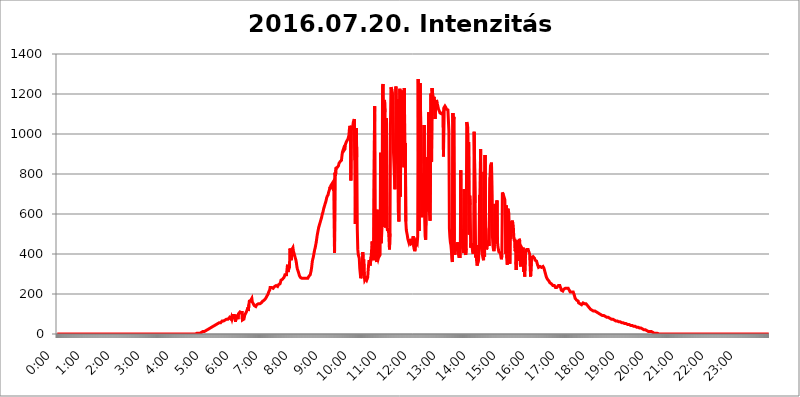
| Category | 2016.07.20. Intenzitás [W/m^2] |
|---|---|
| 0.0 | 0 |
| 0.0006944444444444445 | 0 |
| 0.001388888888888889 | 0 |
| 0.0020833333333333333 | 0 |
| 0.002777777777777778 | 0 |
| 0.003472222222222222 | 0 |
| 0.004166666666666667 | 0 |
| 0.004861111111111111 | 0 |
| 0.005555555555555556 | 0 |
| 0.0062499999999999995 | 0 |
| 0.006944444444444444 | 0 |
| 0.007638888888888889 | 0 |
| 0.008333333333333333 | 0 |
| 0.009027777777777779 | 0 |
| 0.009722222222222222 | 0 |
| 0.010416666666666666 | 0 |
| 0.011111111111111112 | 0 |
| 0.011805555555555555 | 0 |
| 0.012499999999999999 | 0 |
| 0.013194444444444444 | 0 |
| 0.013888888888888888 | 0 |
| 0.014583333333333332 | 0 |
| 0.015277777777777777 | 0 |
| 0.015972222222222224 | 0 |
| 0.016666666666666666 | 0 |
| 0.017361111111111112 | 0 |
| 0.018055555555555557 | 0 |
| 0.01875 | 0 |
| 0.019444444444444445 | 0 |
| 0.02013888888888889 | 0 |
| 0.020833333333333332 | 0 |
| 0.02152777777777778 | 0 |
| 0.022222222222222223 | 0 |
| 0.02291666666666667 | 0 |
| 0.02361111111111111 | 0 |
| 0.024305555555555556 | 0 |
| 0.024999999999999998 | 0 |
| 0.025694444444444447 | 0 |
| 0.02638888888888889 | 0 |
| 0.027083333333333334 | 0 |
| 0.027777777777777776 | 0 |
| 0.02847222222222222 | 0 |
| 0.029166666666666664 | 0 |
| 0.029861111111111113 | 0 |
| 0.030555555555555555 | 0 |
| 0.03125 | 0 |
| 0.03194444444444445 | 0 |
| 0.03263888888888889 | 0 |
| 0.03333333333333333 | 0 |
| 0.034027777777777775 | 0 |
| 0.034722222222222224 | 0 |
| 0.035416666666666666 | 0 |
| 0.036111111111111115 | 0 |
| 0.03680555555555556 | 0 |
| 0.0375 | 0 |
| 0.03819444444444444 | 0 |
| 0.03888888888888889 | 0 |
| 0.03958333333333333 | 0 |
| 0.04027777777777778 | 0 |
| 0.04097222222222222 | 0 |
| 0.041666666666666664 | 0 |
| 0.042361111111111106 | 0 |
| 0.04305555555555556 | 0 |
| 0.043750000000000004 | 0 |
| 0.044444444444444446 | 0 |
| 0.04513888888888889 | 0 |
| 0.04583333333333334 | 0 |
| 0.04652777777777778 | 0 |
| 0.04722222222222222 | 0 |
| 0.04791666666666666 | 0 |
| 0.04861111111111111 | 0 |
| 0.049305555555555554 | 0 |
| 0.049999999999999996 | 0 |
| 0.05069444444444445 | 0 |
| 0.051388888888888894 | 0 |
| 0.052083333333333336 | 0 |
| 0.05277777777777778 | 0 |
| 0.05347222222222222 | 0 |
| 0.05416666666666667 | 0 |
| 0.05486111111111111 | 0 |
| 0.05555555555555555 | 0 |
| 0.05625 | 0 |
| 0.05694444444444444 | 0 |
| 0.057638888888888885 | 0 |
| 0.05833333333333333 | 0 |
| 0.05902777777777778 | 0 |
| 0.059722222222222225 | 0 |
| 0.06041666666666667 | 0 |
| 0.061111111111111116 | 0 |
| 0.06180555555555556 | 0 |
| 0.0625 | 0 |
| 0.06319444444444444 | 0 |
| 0.06388888888888888 | 0 |
| 0.06458333333333334 | 0 |
| 0.06527777777777778 | 0 |
| 0.06597222222222222 | 0 |
| 0.06666666666666667 | 0 |
| 0.06736111111111111 | 0 |
| 0.06805555555555555 | 0 |
| 0.06874999999999999 | 0 |
| 0.06944444444444443 | 0 |
| 0.07013888888888889 | 0 |
| 0.07083333333333333 | 0 |
| 0.07152777777777779 | 0 |
| 0.07222222222222223 | 0 |
| 0.07291666666666667 | 0 |
| 0.07361111111111111 | 0 |
| 0.07430555555555556 | 0 |
| 0.075 | 0 |
| 0.07569444444444444 | 0 |
| 0.0763888888888889 | 0 |
| 0.07708333333333334 | 0 |
| 0.07777777777777778 | 0 |
| 0.07847222222222222 | 0 |
| 0.07916666666666666 | 0 |
| 0.0798611111111111 | 0 |
| 0.08055555555555556 | 0 |
| 0.08125 | 0 |
| 0.08194444444444444 | 0 |
| 0.08263888888888889 | 0 |
| 0.08333333333333333 | 0 |
| 0.08402777777777777 | 0 |
| 0.08472222222222221 | 0 |
| 0.08541666666666665 | 0 |
| 0.08611111111111112 | 0 |
| 0.08680555555555557 | 0 |
| 0.08750000000000001 | 0 |
| 0.08819444444444445 | 0 |
| 0.08888888888888889 | 0 |
| 0.08958333333333333 | 0 |
| 0.09027777777777778 | 0 |
| 0.09097222222222222 | 0 |
| 0.09166666666666667 | 0 |
| 0.09236111111111112 | 0 |
| 0.09305555555555556 | 0 |
| 0.09375 | 0 |
| 0.09444444444444444 | 0 |
| 0.09513888888888888 | 0 |
| 0.09583333333333333 | 0 |
| 0.09652777777777777 | 0 |
| 0.09722222222222222 | 0 |
| 0.09791666666666667 | 0 |
| 0.09861111111111111 | 0 |
| 0.09930555555555555 | 0 |
| 0.09999999999999999 | 0 |
| 0.10069444444444443 | 0 |
| 0.1013888888888889 | 0 |
| 0.10208333333333335 | 0 |
| 0.10277777777777779 | 0 |
| 0.10347222222222223 | 0 |
| 0.10416666666666667 | 0 |
| 0.10486111111111111 | 0 |
| 0.10555555555555556 | 0 |
| 0.10625 | 0 |
| 0.10694444444444444 | 0 |
| 0.1076388888888889 | 0 |
| 0.10833333333333334 | 0 |
| 0.10902777777777778 | 0 |
| 0.10972222222222222 | 0 |
| 0.1111111111111111 | 0 |
| 0.11180555555555556 | 0 |
| 0.11180555555555556 | 0 |
| 0.1125 | 0 |
| 0.11319444444444444 | 0 |
| 0.11388888888888889 | 0 |
| 0.11458333333333333 | 0 |
| 0.11527777777777777 | 0 |
| 0.11597222222222221 | 0 |
| 0.11666666666666665 | 0 |
| 0.1173611111111111 | 0 |
| 0.11805555555555557 | 0 |
| 0.11944444444444445 | 0 |
| 0.12013888888888889 | 0 |
| 0.12083333333333333 | 0 |
| 0.12152777777777778 | 0 |
| 0.12222222222222223 | 0 |
| 0.12291666666666667 | 0 |
| 0.12291666666666667 | 0 |
| 0.12361111111111112 | 0 |
| 0.12430555555555556 | 0 |
| 0.125 | 0 |
| 0.12569444444444444 | 0 |
| 0.12638888888888888 | 0 |
| 0.12708333333333333 | 0 |
| 0.16875 | 0 |
| 0.12847222222222224 | 0 |
| 0.12916666666666668 | 0 |
| 0.12986111111111112 | 0 |
| 0.13055555555555556 | 0 |
| 0.13125 | 0 |
| 0.13194444444444445 | 0 |
| 0.1326388888888889 | 0 |
| 0.13333333333333333 | 0 |
| 0.13402777777777777 | 0 |
| 0.13402777777777777 | 0 |
| 0.13472222222222222 | 0 |
| 0.13541666666666666 | 0 |
| 0.1361111111111111 | 0 |
| 0.13749999999999998 | 0 |
| 0.13819444444444443 | 0 |
| 0.1388888888888889 | 0 |
| 0.13958333333333334 | 0 |
| 0.14027777777777778 | 0 |
| 0.14097222222222222 | 0 |
| 0.14166666666666666 | 0 |
| 0.1423611111111111 | 0 |
| 0.14305555555555557 | 0 |
| 0.14375000000000002 | 0 |
| 0.14444444444444446 | 0 |
| 0.1451388888888889 | 0 |
| 0.1451388888888889 | 0 |
| 0.14652777777777778 | 0 |
| 0.14722222222222223 | 0 |
| 0.14791666666666667 | 0 |
| 0.1486111111111111 | 0 |
| 0.14930555555555555 | 0 |
| 0.15 | 0 |
| 0.15069444444444444 | 0 |
| 0.15138888888888888 | 0 |
| 0.15208333333333332 | 0 |
| 0.15277777777777776 | 0 |
| 0.15347222222222223 | 0 |
| 0.15416666666666667 | 0 |
| 0.15486111111111112 | 0 |
| 0.15555555555555556 | 0 |
| 0.15625 | 0 |
| 0.15694444444444444 | 0 |
| 0.15763888888888888 | 0 |
| 0.15833333333333333 | 0 |
| 0.15902777777777777 | 0 |
| 0.15972222222222224 | 0 |
| 0.16041666666666668 | 0 |
| 0.16111111111111112 | 0 |
| 0.16180555555555556 | 0 |
| 0.1625 | 0 |
| 0.16319444444444445 | 0 |
| 0.1638888888888889 | 0 |
| 0.16458333333333333 | 0 |
| 0.16527777777777777 | 0 |
| 0.16597222222222222 | 0 |
| 0.16666666666666666 | 0 |
| 0.1673611111111111 | 0 |
| 0.16805555555555554 | 0 |
| 0.16874999999999998 | 0 |
| 0.16944444444444443 | 0 |
| 0.17013888888888887 | 0 |
| 0.1708333333333333 | 0 |
| 0.17152777777777775 | 0 |
| 0.17222222222222225 | 0 |
| 0.1729166666666667 | 0 |
| 0.17361111111111113 | 0 |
| 0.17430555555555557 | 0 |
| 0.17500000000000002 | 0 |
| 0.17569444444444446 | 0 |
| 0.1763888888888889 | 0 |
| 0.17708333333333334 | 0 |
| 0.17777777777777778 | 0 |
| 0.17847222222222223 | 0 |
| 0.17916666666666667 | 0 |
| 0.1798611111111111 | 0 |
| 0.18055555555555555 | 0 |
| 0.18125 | 0 |
| 0.18194444444444444 | 0 |
| 0.1826388888888889 | 0 |
| 0.18333333333333335 | 0 |
| 0.1840277777777778 | 0 |
| 0.18472222222222223 | 0 |
| 0.18541666666666667 | 0 |
| 0.18611111111111112 | 0 |
| 0.18680555555555556 | 0 |
| 0.1875 | 0 |
| 0.18819444444444444 | 0 |
| 0.18888888888888888 | 0 |
| 0.18958333333333333 | 0 |
| 0.19027777777777777 | 0 |
| 0.1909722222222222 | 0 |
| 0.19166666666666665 | 0 |
| 0.19236111111111112 | 0 |
| 0.19305555555555554 | 0 |
| 0.19375 | 0 |
| 0.19444444444444445 | 3.525 |
| 0.1951388888888889 | 3.525 |
| 0.19583333333333333 | 3.525 |
| 0.19652777777777777 | 3.525 |
| 0.19722222222222222 | 3.525 |
| 0.19791666666666666 | 3.525 |
| 0.1986111111111111 | 3.525 |
| 0.19930555555555554 | 3.525 |
| 0.19999999999999998 | 3.525 |
| 0.20069444444444443 | 7.887 |
| 0.20138888888888887 | 7.887 |
| 0.2020833333333333 | 7.887 |
| 0.2027777777777778 | 7.887 |
| 0.2034722222222222 | 12.257 |
| 0.2041666666666667 | 12.257 |
| 0.20486111111111113 | 12.257 |
| 0.20555555555555557 | 12.257 |
| 0.20625000000000002 | 12.257 |
| 0.20694444444444446 | 16.636 |
| 0.2076388888888889 | 16.636 |
| 0.20833333333333334 | 16.636 |
| 0.20902777777777778 | 16.636 |
| 0.20972222222222223 | 21.024 |
| 0.21041666666666667 | 21.024 |
| 0.2111111111111111 | 21.024 |
| 0.21180555555555555 | 21.024 |
| 0.2125 | 25.419 |
| 0.21319444444444444 | 25.419 |
| 0.2138888888888889 | 29.823 |
| 0.21458333333333335 | 29.823 |
| 0.2152777777777778 | 29.823 |
| 0.21597222222222223 | 34.234 |
| 0.21666666666666667 | 34.234 |
| 0.21736111111111112 | 34.234 |
| 0.21805555555555556 | 38.653 |
| 0.21875 | 38.653 |
| 0.21944444444444444 | 38.653 |
| 0.22013888888888888 | 43.079 |
| 0.22083333333333333 | 43.079 |
| 0.22152777777777777 | 43.079 |
| 0.2222222222222222 | 43.079 |
| 0.22291666666666665 | 47.511 |
| 0.2236111111111111 | 47.511 |
| 0.22430555555555556 | 47.511 |
| 0.225 | 51.951 |
| 0.22569444444444445 | 51.951 |
| 0.2263888888888889 | 51.951 |
| 0.22708333333333333 | 56.398 |
| 0.22777777777777777 | 56.398 |
| 0.22847222222222222 | 56.398 |
| 0.22916666666666666 | 56.398 |
| 0.2298611111111111 | 60.85 |
| 0.23055555555555554 | 60.85 |
| 0.23124999999999998 | 65.31 |
| 0.23194444444444443 | 65.31 |
| 0.23263888888888887 | 65.31 |
| 0.2333333333333333 | 65.31 |
| 0.2340277777777778 | 69.775 |
| 0.2347222222222222 | 69.775 |
| 0.2354166666666667 | 69.775 |
| 0.23611111111111113 | 74.246 |
| 0.23680555555555557 | 74.246 |
| 0.23750000000000002 | 74.246 |
| 0.23819444444444446 | 74.246 |
| 0.2388888888888889 | 74.246 |
| 0.23958333333333334 | 74.246 |
| 0.24027777777777778 | 74.246 |
| 0.24097222222222223 | 78.722 |
| 0.24166666666666667 | 83.205 |
| 0.2423611111111111 | 83.205 |
| 0.24305555555555555 | 83.205 |
| 0.24375 | 74.246 |
| 0.24444444444444446 | 83.205 |
| 0.24513888888888888 | 74.246 |
| 0.24583333333333335 | 83.205 |
| 0.2465277777777778 | 92.184 |
| 0.24722222222222223 | 92.184 |
| 0.24791666666666667 | 92.184 |
| 0.24861111111111112 | 92.184 |
| 0.24930555555555556 | 83.205 |
| 0.25 | 60.85 |
| 0.25069444444444444 | 83.205 |
| 0.2513888888888889 | 96.682 |
| 0.2520833333333333 | 101.184 |
| 0.25277777777777777 | 101.184 |
| 0.2534722222222222 | 74.246 |
| 0.25416666666666665 | 101.184 |
| 0.2548611111111111 | 105.69 |
| 0.2555555555555556 | 105.69 |
| 0.25625000000000003 | 110.201 |
| 0.2569444444444445 | 110.201 |
| 0.2576388888888889 | 110.201 |
| 0.25833333333333336 | 105.69 |
| 0.2590277777777778 | 114.716 |
| 0.25972222222222224 | 69.775 |
| 0.2604166666666667 | 74.246 |
| 0.2611111111111111 | 74.246 |
| 0.26180555555555557 | 74.246 |
| 0.2625 | 69.775 |
| 0.26319444444444445 | 96.682 |
| 0.2638888888888889 | 96.682 |
| 0.26458333333333334 | 96.682 |
| 0.2652777777777778 | 110.201 |
| 0.2659722222222222 | 110.201 |
| 0.26666666666666666 | 123.758 |
| 0.2673611111111111 | 132.814 |
| 0.26805555555555555 | 114.716 |
| 0.26875 | 146.423 |
| 0.26944444444444443 | 164.605 |
| 0.2701388888888889 | 169.156 |
| 0.2708333333333333 | 164.605 |
| 0.27152777777777776 | 169.156 |
| 0.2722222222222222 | 164.605 |
| 0.27291666666666664 | 178.264 |
| 0.2736111111111111 | 160.056 |
| 0.2743055555555555 | 160.056 |
| 0.27499999999999997 | 150.964 |
| 0.27569444444444446 | 146.423 |
| 0.27638888888888885 | 141.884 |
| 0.27708333333333335 | 137.347 |
| 0.2777777777777778 | 137.347 |
| 0.27847222222222223 | 137.347 |
| 0.2791666666666667 | 141.884 |
| 0.2798611111111111 | 146.423 |
| 0.28055555555555556 | 150.964 |
| 0.28125 | 150.964 |
| 0.28194444444444444 | 150.964 |
| 0.2826388888888889 | 146.423 |
| 0.2833333333333333 | 146.423 |
| 0.28402777777777777 | 150.964 |
| 0.2847222222222222 | 150.964 |
| 0.28541666666666665 | 150.964 |
| 0.28611111111111115 | 155.509 |
| 0.28680555555555554 | 155.509 |
| 0.28750000000000003 | 160.056 |
| 0.2881944444444445 | 164.605 |
| 0.2888888888888889 | 164.605 |
| 0.28958333333333336 | 164.605 |
| 0.2902777777777778 | 169.156 |
| 0.29097222222222224 | 169.156 |
| 0.2916666666666667 | 173.709 |
| 0.2923611111111111 | 178.264 |
| 0.29305555555555557 | 182.82 |
| 0.29375 | 187.378 |
| 0.29444444444444445 | 187.378 |
| 0.2951388888888889 | 191.937 |
| 0.29583333333333334 | 201.058 |
| 0.2965277777777778 | 210.182 |
| 0.2972222222222222 | 210.182 |
| 0.29791666666666666 | 219.309 |
| 0.2986111111111111 | 233 |
| 0.29930555555555555 | 233 |
| 0.3 | 233 |
| 0.30069444444444443 | 233 |
| 0.3013888888888889 | 228.436 |
| 0.3020833333333333 | 228.436 |
| 0.30277777777777776 | 228.436 |
| 0.3034722222222222 | 228.436 |
| 0.30416666666666664 | 233 |
| 0.3048611111111111 | 237.564 |
| 0.3055555555555555 | 242.127 |
| 0.30624999999999997 | 242.127 |
| 0.3069444444444444 | 242.127 |
| 0.3076388888888889 | 237.564 |
| 0.30833333333333335 | 237.564 |
| 0.3090277777777778 | 237.564 |
| 0.30972222222222223 | 242.127 |
| 0.3104166666666667 | 246.689 |
| 0.3111111111111111 | 246.689 |
| 0.31180555555555556 | 246.689 |
| 0.3125 | 251.251 |
| 0.31319444444444444 | 260.373 |
| 0.3138888888888889 | 269.49 |
| 0.3145833333333333 | 274.047 |
| 0.31527777777777777 | 274.047 |
| 0.3159722222222222 | 274.047 |
| 0.31666666666666665 | 274.047 |
| 0.31736111111111115 | 278.603 |
| 0.31805555555555554 | 283.156 |
| 0.31875000000000003 | 283.156 |
| 0.3194444444444445 | 296.808 |
| 0.3201388888888889 | 292.259 |
| 0.32083333333333336 | 292.259 |
| 0.3215277777777778 | 296.808 |
| 0.32222222222222224 | 301.354 |
| 0.3229166666666667 | 346.682 |
| 0.3236111111111111 | 310.44 |
| 0.32430555555555557 | 319.517 |
| 0.325 | 324.052 |
| 0.32569444444444445 | 333.113 |
| 0.3263888888888889 | 427.39 |
| 0.32708333333333334 | 405.108 |
| 0.3277777777777778 | 378.224 |
| 0.3284722222222222 | 369.23 |
| 0.32916666666666666 | 422.943 |
| 0.3298611111111111 | 427.39 |
| 0.33055555555555555 | 431.833 |
| 0.33125 | 414.035 |
| 0.33194444444444443 | 405.108 |
| 0.3326388888888889 | 396.164 |
| 0.3333333333333333 | 387.202 |
| 0.3340277777777778 | 378.224 |
| 0.3347222222222222 | 369.23 |
| 0.3354166666666667 | 355.712 |
| 0.3361111111111111 | 337.639 |
| 0.3368055555555556 | 324.052 |
| 0.33749999999999997 | 319.517 |
| 0.33819444444444446 | 310.44 |
| 0.33888888888888885 | 301.354 |
| 0.33958333333333335 | 292.259 |
| 0.34027777777777773 | 287.709 |
| 0.34097222222222223 | 283.156 |
| 0.3416666666666666 | 278.603 |
| 0.3423611111111111 | 278.603 |
| 0.3430555555555555 | 278.603 |
| 0.34375 | 278.603 |
| 0.3444444444444445 | 274.047 |
| 0.3451388888888889 | 278.603 |
| 0.3458333333333334 | 278.603 |
| 0.34652777777777777 | 278.603 |
| 0.34722222222222227 | 278.603 |
| 0.34791666666666665 | 278.603 |
| 0.34861111111111115 | 278.603 |
| 0.34930555555555554 | 278.603 |
| 0.35000000000000003 | 278.603 |
| 0.3506944444444444 | 278.603 |
| 0.3513888888888889 | 278.603 |
| 0.3520833333333333 | 283.156 |
| 0.3527777777777778 | 287.709 |
| 0.3534722222222222 | 287.709 |
| 0.3541666666666667 | 292.259 |
| 0.3548611111111111 | 296.808 |
| 0.35555555555555557 | 301.354 |
| 0.35625 | 319.517 |
| 0.35694444444444445 | 337.639 |
| 0.3576388888888889 | 360.221 |
| 0.35833333333333334 | 373.729 |
| 0.3590277777777778 | 382.715 |
| 0.3597222222222222 | 396.164 |
| 0.36041666666666666 | 409.574 |
| 0.3611111111111111 | 422.943 |
| 0.36180555555555555 | 431.833 |
| 0.3625 | 445.129 |
| 0.36319444444444443 | 458.38 |
| 0.3638888888888889 | 475.972 |
| 0.3645833333333333 | 493.475 |
| 0.3652777777777778 | 506.542 |
| 0.3659722222222222 | 519.555 |
| 0.3666666666666667 | 532.513 |
| 0.3673611111111111 | 536.82 |
| 0.3680555555555556 | 549.704 |
| 0.36874999999999997 | 558.261 |
| 0.36944444444444446 | 566.793 |
| 0.37013888888888885 | 575.299 |
| 0.37083333333333335 | 583.779 |
| 0.37152777777777773 | 596.45 |
| 0.37222222222222223 | 604.864 |
| 0.3729166666666666 | 613.252 |
| 0.3736111111111111 | 625.784 |
| 0.3743055555555555 | 634.105 |
| 0.375 | 642.4 |
| 0.3756944444444445 | 650.667 |
| 0.3763888888888889 | 658.909 |
| 0.3770833333333334 | 667.123 |
| 0.37777777777777777 | 679.395 |
| 0.37847222222222227 | 687.544 |
| 0.37916666666666665 | 691.608 |
| 0.37986111111111115 | 695.666 |
| 0.38055555555555554 | 707.8 |
| 0.38125000000000003 | 715.858 |
| 0.3819444444444444 | 723.889 |
| 0.3826388888888889 | 735.89 |
| 0.3833333333333333 | 723.889 |
| 0.3840277777777778 | 743.859 |
| 0.3847222222222222 | 747.834 |
| 0.3854166666666667 | 751.803 |
| 0.3861111111111111 | 755.766 |
| 0.38680555555555557 | 759.723 |
| 0.3875 | 715.858 |
| 0.38819444444444445 | 763.674 |
| 0.3888888888888889 | 405.108 |
| 0.38958333333333334 | 806.757 |
| 0.3902777777777778 | 791.169 |
| 0.3909722222222222 | 829.981 |
| 0.39166666666666666 | 833.834 |
| 0.3923611111111111 | 833.834 |
| 0.39305555555555555 | 833.834 |
| 0.39375 | 833.834 |
| 0.39444444444444443 | 841.526 |
| 0.3951388888888889 | 853.029 |
| 0.3958333333333333 | 856.855 |
| 0.3965277777777778 | 860.676 |
| 0.3972222222222222 | 864.493 |
| 0.3979166666666667 | 860.676 |
| 0.3986111111111111 | 868.305 |
| 0.3993055555555556 | 891.099 |
| 0.39999999999999997 | 909.996 |
| 0.40069444444444446 | 917.534 |
| 0.40138888888888885 | 925.06 |
| 0.40208333333333335 | 917.534 |
| 0.40277777777777773 | 917.534 |
| 0.40347222222222223 | 925.06 |
| 0.4041666666666666 | 947.58 |
| 0.4048611111111111 | 955.071 |
| 0.4055555555555555 | 955.071 |
| 0.40625 | 966.295 |
| 0.4069444444444445 | 966.295 |
| 0.4076388888888889 | 973.772 |
| 0.4083333333333334 | 977.508 |
| 0.40902777777777777 | 992.448 |
| 0.40972222222222227 | 1022.323 |
| 0.41041666666666665 | 1041.019 |
| 0.41111111111111115 | 1033.537 |
| 0.41180555555555554 | 767.62 |
| 0.41250000000000003 | 1037.277 |
| 0.4131944444444444 | 1029.798 |
| 0.4138888888888889 | 1033.537 |
| 0.4145833333333333 | 1041.019 |
| 0.4152777777777778 | 1059.756 |
| 0.4159722222222222 | 1067.267 |
| 0.4166666666666667 | 1074.789 |
| 0.4173611111111111 | 868.305 |
| 0.41805555555555557 | 549.704 |
| 0.41875 | 992.448 |
| 0.41944444444444445 | 1029.798 |
| 0.4201388888888889 | 883.516 |
| 0.42083333333333334 | 523.88 |
| 0.4215277777777778 | 422.943 |
| 0.4222222222222222 | 396.164 |
| 0.42291666666666666 | 396.164 |
| 0.4236111111111111 | 378.224 |
| 0.42430555555555555 | 328.584 |
| 0.425 | 301.354 |
| 0.42569444444444443 | 278.603 |
| 0.4263888888888889 | 287.709 |
| 0.4270833333333333 | 305.898 |
| 0.4277777777777778 | 324.052 |
| 0.4284722222222222 | 409.574 |
| 0.4291666666666667 | 364.728 |
| 0.4298611111111111 | 373.729 |
| 0.4305555555555556 | 292.259 |
| 0.43124999999999997 | 269.49 |
| 0.43194444444444446 | 269.49 |
| 0.43263888888888885 | 278.603 |
| 0.43333333333333335 | 278.603 |
| 0.43402777777777773 | 269.49 |
| 0.43472222222222223 | 264.932 |
| 0.4354166666666666 | 283.156 |
| 0.4361111111111111 | 319.517 |
| 0.4368055555555555 | 351.198 |
| 0.4375 | 369.23 |
| 0.4381944444444445 | 355.712 |
| 0.4388888888888889 | 342.162 |
| 0.4395833333333334 | 342.162 |
| 0.44027777777777777 | 387.202 |
| 0.44097222222222227 | 387.202 |
| 0.44166666666666665 | 462.786 |
| 0.44236111111111115 | 427.39 |
| 0.44305555555555554 | 400.638 |
| 0.44375000000000003 | 369.23 |
| 0.4444444444444444 | 369.23 |
| 0.4451388888888889 | 1139.384 |
| 0.4458333333333333 | 414.035 |
| 0.4465277777777778 | 396.164 |
| 0.4472222222222222 | 373.729 |
| 0.4479166666666667 | 360.221 |
| 0.4486111111111111 | 621.613 |
| 0.44930555555555557 | 382.715 |
| 0.45 | 373.729 |
| 0.45069444444444445 | 382.715 |
| 0.4513888888888889 | 382.715 |
| 0.45208333333333334 | 378.224 |
| 0.4527777777777778 | 396.164 |
| 0.4534722222222222 | 906.223 |
| 0.45416666666666666 | 453.968 |
| 0.4548611111111111 | 484.735 |
| 0.45555555555555555 | 541.121 |
| 0.45625 | 1238.014 |
| 0.45694444444444443 | 1250.275 |
| 0.4576388888888889 | 536.82 |
| 0.4583333333333333 | 549.704 |
| 0.4590277777777778 | 1170.358 |
| 0.4597222222222222 | 1108.816 |
| 0.4604166666666667 | 532.513 |
| 0.4611111111111111 | 999.916 |
| 0.4618055555555556 | 1078.555 |
| 0.46249999999999997 | 536.82 |
| 0.46319444444444446 | 515.223 |
| 0.46388888888888885 | 528.2 |
| 0.46458333333333335 | 515.223 |
| 0.46527777777777773 | 475.972 |
| 0.46597222222222223 | 422.943 |
| 0.4666666666666666 | 502.192 |
| 0.4673611111111111 | 1044.762 |
| 0.4680555555555555 | 1233.951 |
| 0.46875 | 1229.899 |
| 0.4694444444444445 | 1217.812 |
| 0.4701388888888889 | 1205.82 |
| 0.4708333333333334 | 1201.843 |
| 0.47152777777777777 | 913.766 |
| 0.47222222222222227 | 917.534 |
| 0.47291666666666665 | 909.996 |
| 0.47361111111111115 | 723.889 |
| 0.47430555555555554 | 891.099 |
| 0.47500000000000003 | 1238.014 |
| 0.4756944444444444 | 1233.951 |
| 0.4763888888888889 | 853.029 |
| 0.4770833333333333 | 894.885 |
| 0.4777777777777778 | 1174.263 |
| 0.4784722222222222 | 609.062 |
| 0.4791666666666667 | 562.53 |
| 0.4798611111111111 | 909.996 |
| 0.48055555555555557 | 1225.859 |
| 0.48125 | 687.544 |
| 0.48194444444444445 | 1067.267 |
| 0.4826388888888889 | 1197.876 |
| 0.48333333333333334 | 1205.82 |
| 0.4840277777777778 | 1217.812 |
| 0.4847222222222222 | 1120.238 |
| 0.48541666666666666 | 925.06 |
| 0.4861111111111111 | 833.834 |
| 0.48680555555555555 | 1229.899 |
| 0.4875 | 891.099 |
| 0.48819444444444443 | 955.071 |
| 0.4888888888888889 | 562.53 |
| 0.4895833333333333 | 519.555 |
| 0.4902777777777778 | 506.542 |
| 0.4909722222222222 | 493.475 |
| 0.4916666666666667 | 475.972 |
| 0.4923611111111111 | 467.187 |
| 0.4930555555555556 | 458.38 |
| 0.49374999999999997 | 462.786 |
| 0.49444444444444446 | 475.972 |
| 0.49513888888888885 | 458.38 |
| 0.49583333333333335 | 449.551 |
| 0.49652777777777773 | 445.129 |
| 0.49722222222222223 | 445.129 |
| 0.4979166666666666 | 453.968 |
| 0.4986111111111111 | 453.968 |
| 0.4993055555555555 | 489.108 |
| 0.5 | 436.27 |
| 0.5006944444444444 | 422.943 |
| 0.5013888888888889 | 414.035 |
| 0.5020833333333333 | 427.39 |
| 0.5027777777777778 | 445.129 |
| 0.5034722222222222 | 462.786 |
| 0.5041666666666667 | 462.786 |
| 0.5048611111111111 | 453.968 |
| 0.5055555555555555 | 489.108 |
| 0.50625 | 1275.142 |
| 0.5069444444444444 | 617.436 |
| 0.5076388888888889 | 515.223 |
| 0.5083333333333333 | 958.814 |
| 0.5090277777777777 | 1254.387 |
| 0.5097222222222222 | 1258.511 |
| 0.5104166666666666 | 853.029 |
| 0.5111111111111112 | 583.779 |
| 0.5118055555555555 | 583.779 |
| 0.5125000000000001 | 759.723 |
| 0.5131944444444444 | 802.868 |
| 0.513888888888889 | 596.45 |
| 0.5145833333333333 | 1044.762 |
| 0.5152777777777778 | 583.779 |
| 0.5159722222222222 | 489.108 |
| 0.5166666666666667 | 471.582 |
| 0.517361111111111 | 613.252 |
| 0.5180555555555556 | 883.516 |
| 0.5187499999999999 | 613.252 |
| 0.5194444444444445 | 650.667 |
| 0.5201388888888888 | 833.834 |
| 0.5208333333333334 | 1108.816 |
| 0.5215277777777778 | 613.252 |
| 0.5222222222222223 | 596.45 |
| 0.5229166666666667 | 566.793 |
| 0.5236111111111111 | 566.793 |
| 0.5243055555555556 | 1201.843 |
| 0.525 | 860.676 |
| 0.5256944444444445 | 1229.899 |
| 0.5263888888888889 | 1205.82 |
| 0.5270833333333333 | 1186.03 |
| 0.5277777777777778 | 1170.358 |
| 0.5284722222222222 | 1186.03 |
| 0.5291666666666667 | 1186.03 |
| 0.5298611111111111 | 1074.789 |
| 0.5305555555555556 | 1124.056 |
| 0.53125 | 1120.238 |
| 0.5319444444444444 | 1170.358 |
| 0.5326388888888889 | 1154.814 |
| 0.5333333333333333 | 1147.086 |
| 0.5340277777777778 | 1135.543 |
| 0.5347222222222222 | 1124.056 |
| 0.5354166666666667 | 1120.238 |
| 0.5361111111111111 | 1112.618 |
| 0.5368055555555555 | 1105.019 |
| 0.5375 | 1101.226 |
| 0.5381944444444444 | 1101.226 |
| 0.5388888888888889 | 1101.226 |
| 0.5395833333333333 | 1101.226 |
| 0.5402777777777777 | 1105.019 |
| 0.5409722222222222 | 1108.816 |
| 0.5416666666666666 | 887.309 |
| 0.5423611111111112 | 1131.708 |
| 0.5430555555555555 | 1135.543 |
| 0.5437500000000001 | 1139.384 |
| 0.5444444444444444 | 1135.543 |
| 0.545138888888889 | 1131.708 |
| 0.5458333333333333 | 1124.056 |
| 0.5465277777777778 | 1124.056 |
| 0.5472222222222222 | 1127.879 |
| 0.5479166666666667 | 1120.238 |
| 0.548611111111111 | 1124.056 |
| 0.5493055555555556 | 1014.852 |
| 0.5499999999999999 | 528.2 |
| 0.5506944444444445 | 484.735 |
| 0.5513888888888888 | 458.38 |
| 0.5520833333333334 | 445.129 |
| 0.5527777777777778 | 418.492 |
| 0.5534722222222223 | 378.224 |
| 0.5541666666666667 | 360.221 |
| 0.5548611111111111 | 1105.019 |
| 0.5555555555555556 | 1059.756 |
| 0.55625 | 1086.097 |
| 0.5569444444444445 | 467.187 |
| 0.5576388888888889 | 396.164 |
| 0.5583333333333333 | 431.833 |
| 0.5590277777777778 | 414.035 |
| 0.5597222222222222 | 431.833 |
| 0.5604166666666667 | 445.129 |
| 0.5611111111111111 | 458.38 |
| 0.5618055555555556 | 440.702 |
| 0.5625 | 405.108 |
| 0.5631944444444444 | 387.202 |
| 0.5638888888888889 | 382.715 |
| 0.5645833333333333 | 382.715 |
| 0.5652777777777778 | 387.202 |
| 0.5659722222222222 | 818.392 |
| 0.5666666666666667 | 462.786 |
| 0.5673611111111111 | 480.356 |
| 0.5680555555555555 | 523.88 |
| 0.56875 | 427.39 |
| 0.5694444444444444 | 414.035 |
| 0.5701388888888889 | 405.108 |
| 0.5708333333333333 | 723.889 |
| 0.5715277777777777 | 445.129 |
| 0.5722222222222222 | 405.108 |
| 0.5729166666666666 | 396.164 |
| 0.5736111111111112 | 427.39 |
| 0.5743055555555555 | 1059.756 |
| 0.5750000000000001 | 1059.756 |
| 0.5756944444444444 | 1033.537 |
| 0.576388888888889 | 943.832 |
| 0.5770833333333333 | 958.814 |
| 0.5777777777777778 | 497.836 |
| 0.5784722222222222 | 691.608 |
| 0.5791666666666667 | 646.537 |
| 0.579861111111111 | 431.833 |
| 0.5805555555555556 | 453.968 |
| 0.5812499999999999 | 440.702 |
| 0.5819444444444445 | 431.833 |
| 0.5826388888888888 | 409.574 |
| 0.5833333333333334 | 400.638 |
| 0.5840277777777778 | 414.035 |
| 0.5847222222222223 | 1011.118 |
| 0.5854166666666667 | 1007.383 |
| 0.5861111111111111 | 654.791 |
| 0.5868055555555556 | 382.715 |
| 0.5875 | 445.129 |
| 0.5881944444444445 | 364.728 |
| 0.5888888888888889 | 342.162 |
| 0.5895833333333333 | 337.639 |
| 0.5902777777777778 | 346.682 |
| 0.5909722222222222 | 373.729 |
| 0.5916666666666667 | 440.702 |
| 0.5923611111111111 | 695.666 |
| 0.5930555555555556 | 658.909 |
| 0.59375 | 925.06 |
| 0.5944444444444444 | 449.551 |
| 0.5951388888888889 | 422.943 |
| 0.5958333333333333 | 405.108 |
| 0.5965277777777778 | 391.685 |
| 0.5972222222222222 | 378.224 |
| 0.5979166666666667 | 369.23 |
| 0.5986111111111111 | 810.641 |
| 0.5993055555555555 | 387.202 |
| 0.6 | 894.885 |
| 0.6006944444444444 | 532.513 |
| 0.6013888888888889 | 523.88 |
| 0.6020833333333333 | 422.943 |
| 0.6027777777777777 | 431.833 |
| 0.6034722222222222 | 431.833 |
| 0.6041666666666666 | 431.833 |
| 0.6048611111111112 | 467.187 |
| 0.6055555555555555 | 440.702 |
| 0.6062500000000001 | 440.702 |
| 0.6069444444444444 | 783.342 |
| 0.607638888888889 | 841.526 |
| 0.6083333333333333 | 845.365 |
| 0.6090277777777778 | 856.855 |
| 0.6097222222222222 | 860.676 |
| 0.6104166666666667 | 484.735 |
| 0.611111111111111 | 440.702 |
| 0.6118055555555556 | 422.943 |
| 0.6124999999999999 | 414.035 |
| 0.6131944444444445 | 445.129 |
| 0.6138888888888888 | 650.667 |
| 0.6145833333333334 | 453.968 |
| 0.6152777777777778 | 566.793 |
| 0.6159722222222223 | 475.972 |
| 0.6166666666666667 | 667.123 |
| 0.6173611111111111 | 462.786 |
| 0.6180555555555556 | 436.27 |
| 0.61875 | 422.943 |
| 0.6194444444444445 | 409.574 |
| 0.6201388888888889 | 409.574 |
| 0.6208333333333333 | 414.035 |
| 0.6215277777777778 | 405.108 |
| 0.6222222222222222 | 387.202 |
| 0.6229166666666667 | 373.729 |
| 0.6236111111111111 | 391.685 |
| 0.6243055555555556 | 707.8 |
| 0.625 | 703.762 |
| 0.6256944444444444 | 695.666 |
| 0.6263888888888889 | 687.544 |
| 0.6270833333333333 | 683.473 |
| 0.6277777777777778 | 671.22 |
| 0.6284722222222222 | 536.82 |
| 0.6291666666666667 | 400.638 |
| 0.6298611111111111 | 642.4 |
| 0.6305555555555555 | 378.224 |
| 0.63125 | 346.682 |
| 0.6319444444444444 | 625.784 |
| 0.6326388888888889 | 617.436 |
| 0.6333333333333333 | 604.864 |
| 0.6340277777777777 | 502.192 |
| 0.6347222222222222 | 351.198 |
| 0.6354166666666666 | 549.704 |
| 0.6361111111111112 | 475.972 |
| 0.6368055555555555 | 562.53 |
| 0.6375000000000001 | 536.82 |
| 0.6381944444444444 | 566.793 |
| 0.638888888888889 | 553.986 |
| 0.6395833333333333 | 541.121 |
| 0.6402777777777778 | 489.108 |
| 0.6409722222222222 | 467.187 |
| 0.6416666666666667 | 475.972 |
| 0.642361111111111 | 414.035 |
| 0.6430555555555556 | 445.129 |
| 0.6437499999999999 | 319.517 |
| 0.6444444444444445 | 467.187 |
| 0.6451388888888888 | 422.943 |
| 0.6458333333333334 | 449.551 |
| 0.6465277777777778 | 364.728 |
| 0.6472222222222223 | 436.27 |
| 0.6479166666666667 | 475.972 |
| 0.6486111111111111 | 467.187 |
| 0.6493055555555556 | 351.198 |
| 0.65 | 337.639 |
| 0.6506944444444445 | 436.27 |
| 0.6513888888888889 | 436.27 |
| 0.6520833333333333 | 436.27 |
| 0.6527777777777778 | 422.943 |
| 0.6534722222222222 | 431.833 |
| 0.6541666666666667 | 310.44 |
| 0.6548611111111111 | 333.113 |
| 0.6555555555555556 | 287.709 |
| 0.65625 | 292.259 |
| 0.6569444444444444 | 414.035 |
| 0.6576388888888889 | 418.492 |
| 0.6583333333333333 | 422.943 |
| 0.6590277777777778 | 427.39 |
| 0.6597222222222222 | 427.39 |
| 0.6604166666666667 | 422.943 |
| 0.6611111111111111 | 414.035 |
| 0.6618055555555555 | 409.574 |
| 0.6625 | 400.638 |
| 0.6631944444444444 | 342.162 |
| 0.6638888888888889 | 287.709 |
| 0.6645833333333333 | 292.259 |
| 0.6652777777777777 | 382.715 |
| 0.6659722222222222 | 382.715 |
| 0.6666666666666666 | 382.715 |
| 0.6673611111111111 | 387.202 |
| 0.6680555555555556 | 387.202 |
| 0.6687500000000001 | 387.202 |
| 0.6694444444444444 | 378.224 |
| 0.6701388888888888 | 369.23 |
| 0.6708333333333334 | 369.23 |
| 0.6715277777777778 | 369.23 |
| 0.6722222222222222 | 364.728 |
| 0.6729166666666666 | 355.712 |
| 0.6736111111111112 | 346.682 |
| 0.6743055555555556 | 342.162 |
| 0.6749999999999999 | 333.113 |
| 0.6756944444444444 | 328.584 |
| 0.6763888888888889 | 333.113 |
| 0.6770833333333334 | 337.639 |
| 0.6777777777777777 | 337.639 |
| 0.6784722222222223 | 333.113 |
| 0.6791666666666667 | 333.113 |
| 0.6798611111111111 | 333.113 |
| 0.6805555555555555 | 333.113 |
| 0.68125 | 337.639 |
| 0.6819444444444445 | 337.639 |
| 0.6826388888888889 | 328.584 |
| 0.6833333333333332 | 319.517 |
| 0.6840277777777778 | 310.44 |
| 0.6847222222222222 | 301.354 |
| 0.6854166666666667 | 292.259 |
| 0.686111111111111 | 283.156 |
| 0.6868055555555556 | 278.603 |
| 0.6875 | 274.047 |
| 0.6881944444444444 | 274.047 |
| 0.688888888888889 | 269.49 |
| 0.6895833333333333 | 264.932 |
| 0.6902777777777778 | 260.373 |
| 0.6909722222222222 | 255.813 |
| 0.6916666666666668 | 255.813 |
| 0.6923611111111111 | 251.251 |
| 0.6930555555555555 | 251.251 |
| 0.69375 | 251.251 |
| 0.6944444444444445 | 246.689 |
| 0.6951388888888889 | 242.127 |
| 0.6958333333333333 | 242.127 |
| 0.6965277777777777 | 242.127 |
| 0.6972222222222223 | 242.127 |
| 0.6979166666666666 | 237.564 |
| 0.6986111111111111 | 233 |
| 0.6993055555555556 | 233 |
| 0.7000000000000001 | 233 |
| 0.7006944444444444 | 233 |
| 0.7013888888888888 | 233 |
| 0.7020833333333334 | 237.564 |
| 0.7027777777777778 | 242.127 |
| 0.7034722222222222 | 242.127 |
| 0.7041666666666666 | 242.127 |
| 0.7048611111111112 | 242.127 |
| 0.7055555555555556 | 237.564 |
| 0.7062499999999999 | 228.436 |
| 0.7069444444444444 | 219.309 |
| 0.7076388888888889 | 214.746 |
| 0.7083333333333334 | 214.746 |
| 0.7090277777777777 | 214.746 |
| 0.7097222222222223 | 219.309 |
| 0.7104166666666667 | 223.873 |
| 0.7111111111111111 | 228.436 |
| 0.7118055555555555 | 228.436 |
| 0.7125 | 228.436 |
| 0.7131944444444445 | 228.436 |
| 0.7138888888888889 | 228.436 |
| 0.7145833333333332 | 228.436 |
| 0.7152777777777778 | 228.436 |
| 0.7159722222222222 | 228.436 |
| 0.7166666666666667 | 228.436 |
| 0.717361111111111 | 223.873 |
| 0.7180555555555556 | 219.309 |
| 0.71875 | 214.746 |
| 0.7194444444444444 | 210.182 |
| 0.720138888888889 | 210.182 |
| 0.7208333333333333 | 210.182 |
| 0.7215277777777778 | 210.182 |
| 0.7222222222222222 | 210.182 |
| 0.7229166666666668 | 210.182 |
| 0.7236111111111111 | 210.182 |
| 0.7243055555555555 | 205.62 |
| 0.725 | 196.497 |
| 0.7256944444444445 | 187.378 |
| 0.7263888888888889 | 178.264 |
| 0.7270833333333333 | 173.709 |
| 0.7277777777777777 | 173.709 |
| 0.7284722222222223 | 169.156 |
| 0.7291666666666666 | 169.156 |
| 0.7298611111111111 | 164.605 |
| 0.7305555555555556 | 164.605 |
| 0.7312500000000001 | 155.509 |
| 0.7319444444444444 | 155.509 |
| 0.7326388888888888 | 155.509 |
| 0.7333333333333334 | 150.964 |
| 0.7340277777777778 | 150.964 |
| 0.7347222222222222 | 146.423 |
| 0.7354166666666666 | 146.423 |
| 0.7361111111111112 | 146.423 |
| 0.7368055555555556 | 150.964 |
| 0.7374999999999999 | 155.509 |
| 0.7381944444444444 | 155.509 |
| 0.7388888888888889 | 155.509 |
| 0.7395833333333334 | 150.964 |
| 0.7402777777777777 | 150.964 |
| 0.7409722222222223 | 150.964 |
| 0.7416666666666667 | 150.964 |
| 0.7423611111111111 | 146.423 |
| 0.7430555555555555 | 146.423 |
| 0.74375 | 141.884 |
| 0.7444444444444445 | 137.347 |
| 0.7451388888888889 | 137.347 |
| 0.7458333333333332 | 132.814 |
| 0.7465277777777778 | 128.284 |
| 0.7472222222222222 | 128.284 |
| 0.7479166666666667 | 123.758 |
| 0.748611111111111 | 123.758 |
| 0.7493055555555556 | 119.235 |
| 0.75 | 119.235 |
| 0.7506944444444444 | 119.235 |
| 0.751388888888889 | 114.716 |
| 0.7520833333333333 | 114.716 |
| 0.7527777777777778 | 114.716 |
| 0.7534722222222222 | 114.716 |
| 0.7541666666666668 | 114.716 |
| 0.7548611111111111 | 114.716 |
| 0.7555555555555555 | 110.201 |
| 0.75625 | 110.201 |
| 0.7569444444444445 | 110.201 |
| 0.7576388888888889 | 110.201 |
| 0.7583333333333333 | 105.69 |
| 0.7590277777777777 | 101.184 |
| 0.7597222222222223 | 101.184 |
| 0.7604166666666666 | 101.184 |
| 0.7611111111111111 | 101.184 |
| 0.7618055555555556 | 96.682 |
| 0.7625000000000001 | 96.682 |
| 0.7631944444444444 | 96.682 |
| 0.7638888888888888 | 92.184 |
| 0.7645833333333334 | 92.184 |
| 0.7652777777777778 | 92.184 |
| 0.7659722222222222 | 92.184 |
| 0.7666666666666666 | 92.184 |
| 0.7673611111111112 | 92.184 |
| 0.7680555555555556 | 87.692 |
| 0.7687499999999999 | 87.692 |
| 0.7694444444444444 | 87.692 |
| 0.7701388888888889 | 87.692 |
| 0.7708333333333334 | 83.205 |
| 0.7715277777777777 | 83.205 |
| 0.7722222222222223 | 83.205 |
| 0.7729166666666667 | 83.205 |
| 0.7736111111111111 | 83.205 |
| 0.7743055555555555 | 78.722 |
| 0.775 | 78.722 |
| 0.7756944444444445 | 78.722 |
| 0.7763888888888889 | 78.722 |
| 0.7770833333333332 | 74.246 |
| 0.7777777777777778 | 74.246 |
| 0.7784722222222222 | 74.246 |
| 0.7791666666666667 | 74.246 |
| 0.779861111111111 | 74.246 |
| 0.7805555555555556 | 69.775 |
| 0.78125 | 69.775 |
| 0.7819444444444444 | 69.775 |
| 0.782638888888889 | 69.775 |
| 0.7833333333333333 | 65.31 |
| 0.7840277777777778 | 65.31 |
| 0.7847222222222222 | 65.31 |
| 0.7854166666666668 | 65.31 |
| 0.7861111111111111 | 65.31 |
| 0.7868055555555555 | 65.31 |
| 0.7875 | 60.85 |
| 0.7881944444444445 | 60.85 |
| 0.7888888888888889 | 60.85 |
| 0.7895833333333333 | 60.85 |
| 0.7902777777777777 | 56.398 |
| 0.7909722222222223 | 56.398 |
| 0.7916666666666666 | 56.398 |
| 0.7923611111111111 | 56.398 |
| 0.7930555555555556 | 56.398 |
| 0.7937500000000001 | 56.398 |
| 0.7944444444444444 | 56.398 |
| 0.7951388888888888 | 51.951 |
| 0.7958333333333334 | 51.951 |
| 0.7965277777777778 | 51.951 |
| 0.7972222222222222 | 51.951 |
| 0.7979166666666666 | 51.951 |
| 0.7986111111111112 | 51.951 |
| 0.7993055555555556 | 51.951 |
| 0.7999999999999999 | 47.511 |
| 0.8006944444444444 | 47.511 |
| 0.8013888888888889 | 47.511 |
| 0.8020833333333334 | 47.511 |
| 0.8027777777777777 | 47.511 |
| 0.8034722222222223 | 47.511 |
| 0.8041666666666667 | 43.079 |
| 0.8048611111111111 | 43.079 |
| 0.8055555555555555 | 43.079 |
| 0.80625 | 43.079 |
| 0.8069444444444445 | 43.079 |
| 0.8076388888888889 | 38.653 |
| 0.8083333333333332 | 38.653 |
| 0.8090277777777778 | 38.653 |
| 0.8097222222222222 | 38.653 |
| 0.8104166666666667 | 38.653 |
| 0.811111111111111 | 38.653 |
| 0.8118055555555556 | 38.653 |
| 0.8125 | 34.234 |
| 0.8131944444444444 | 34.234 |
| 0.813888888888889 | 34.234 |
| 0.8145833333333333 | 34.234 |
| 0.8152777777777778 | 29.823 |
| 0.8159722222222222 | 29.823 |
| 0.8166666666666668 | 29.823 |
| 0.8173611111111111 | 29.823 |
| 0.8180555555555555 | 29.823 |
| 0.81875 | 29.823 |
| 0.8194444444444445 | 29.823 |
| 0.8201388888888889 | 25.419 |
| 0.8208333333333333 | 25.419 |
| 0.8215277777777777 | 25.419 |
| 0.8222222222222223 | 25.419 |
| 0.8229166666666666 | 21.024 |
| 0.8236111111111111 | 21.024 |
| 0.8243055555555556 | 21.024 |
| 0.8250000000000001 | 21.024 |
| 0.8256944444444444 | 21.024 |
| 0.8263888888888888 | 16.636 |
| 0.8270833333333334 | 16.636 |
| 0.8277777777777778 | 16.636 |
| 0.8284722222222222 | 16.636 |
| 0.8291666666666666 | 12.257 |
| 0.8298611111111112 | 12.257 |
| 0.8305555555555556 | 12.257 |
| 0.8312499999999999 | 12.257 |
| 0.8319444444444444 | 12.257 |
| 0.8326388888888889 | 7.887 |
| 0.8333333333333334 | 12.257 |
| 0.8340277777777777 | 7.887 |
| 0.8347222222222223 | 7.887 |
| 0.8354166666666667 | 7.887 |
| 0.8361111111111111 | 7.887 |
| 0.8368055555555555 | 3.525 |
| 0.8375 | 3.525 |
| 0.8381944444444445 | 3.525 |
| 0.8388888888888889 | 3.525 |
| 0.8395833333333332 | 3.525 |
| 0.8402777777777778 | 3.525 |
| 0.8409722222222222 | 3.525 |
| 0.8416666666666667 | 3.525 |
| 0.842361111111111 | 3.525 |
| 0.8430555555555556 | 3.525 |
| 0.84375 | 0 |
| 0.8444444444444444 | 0 |
| 0.845138888888889 | 0 |
| 0.8458333333333333 | 0 |
| 0.8465277777777778 | 0 |
| 0.8472222222222222 | 0 |
| 0.8479166666666668 | 0 |
| 0.8486111111111111 | 0 |
| 0.8493055555555555 | 0 |
| 0.85 | 0 |
| 0.8506944444444445 | 0 |
| 0.8513888888888889 | 0 |
| 0.8520833333333333 | 0 |
| 0.8527777777777777 | 0 |
| 0.8534722222222223 | 0 |
| 0.8541666666666666 | 0 |
| 0.8548611111111111 | 0 |
| 0.8555555555555556 | 0 |
| 0.8562500000000001 | 0 |
| 0.8569444444444444 | 0 |
| 0.8576388888888888 | 0 |
| 0.8583333333333334 | 0 |
| 0.8590277777777778 | 0 |
| 0.8597222222222222 | 0 |
| 0.8604166666666666 | 0 |
| 0.8611111111111112 | 0 |
| 0.8618055555555556 | 0 |
| 0.8624999999999999 | 0 |
| 0.8631944444444444 | 0 |
| 0.8638888888888889 | 0 |
| 0.8645833333333334 | 0 |
| 0.8652777777777777 | 0 |
| 0.8659722222222223 | 0 |
| 0.8666666666666667 | 0 |
| 0.8673611111111111 | 0 |
| 0.8680555555555555 | 0 |
| 0.86875 | 0 |
| 0.8694444444444445 | 0 |
| 0.8701388888888889 | 0 |
| 0.8708333333333332 | 0 |
| 0.8715277777777778 | 0 |
| 0.8722222222222222 | 0 |
| 0.8729166666666667 | 0 |
| 0.873611111111111 | 0 |
| 0.8743055555555556 | 0 |
| 0.875 | 0 |
| 0.8756944444444444 | 0 |
| 0.876388888888889 | 0 |
| 0.8770833333333333 | 0 |
| 0.8777777777777778 | 0 |
| 0.8784722222222222 | 0 |
| 0.8791666666666668 | 0 |
| 0.8798611111111111 | 0 |
| 0.8805555555555555 | 0 |
| 0.88125 | 0 |
| 0.8819444444444445 | 0 |
| 0.8826388888888889 | 0 |
| 0.8833333333333333 | 0 |
| 0.8840277777777777 | 0 |
| 0.8847222222222223 | 0 |
| 0.8854166666666666 | 0 |
| 0.8861111111111111 | 0 |
| 0.8868055555555556 | 0 |
| 0.8875000000000001 | 0 |
| 0.8881944444444444 | 0 |
| 0.8888888888888888 | 0 |
| 0.8895833333333334 | 0 |
| 0.8902777777777778 | 0 |
| 0.8909722222222222 | 0 |
| 0.8916666666666666 | 0 |
| 0.8923611111111112 | 0 |
| 0.8930555555555556 | 0 |
| 0.8937499999999999 | 0 |
| 0.8944444444444444 | 0 |
| 0.8951388888888889 | 0 |
| 0.8958333333333334 | 0 |
| 0.8965277777777777 | 0 |
| 0.8972222222222223 | 0 |
| 0.8979166666666667 | 0 |
| 0.8986111111111111 | 0 |
| 0.8993055555555555 | 0 |
| 0.9 | 0 |
| 0.9006944444444445 | 0 |
| 0.9013888888888889 | 0 |
| 0.9020833333333332 | 0 |
| 0.9027777777777778 | 0 |
| 0.9034722222222222 | 0 |
| 0.9041666666666667 | 0 |
| 0.904861111111111 | 0 |
| 0.9055555555555556 | 0 |
| 0.90625 | 0 |
| 0.9069444444444444 | 0 |
| 0.907638888888889 | 0 |
| 0.9083333333333333 | 0 |
| 0.9090277777777778 | 0 |
| 0.9097222222222222 | 0 |
| 0.9104166666666668 | 0 |
| 0.9111111111111111 | 0 |
| 0.9118055555555555 | 0 |
| 0.9125 | 0 |
| 0.9131944444444445 | 0 |
| 0.9138888888888889 | 0 |
| 0.9145833333333333 | 0 |
| 0.9152777777777777 | 0 |
| 0.9159722222222223 | 0 |
| 0.9166666666666666 | 0 |
| 0.9173611111111111 | 0 |
| 0.9180555555555556 | 0 |
| 0.9187500000000001 | 0 |
| 0.9194444444444444 | 0 |
| 0.9201388888888888 | 0 |
| 0.9208333333333334 | 0 |
| 0.9215277777777778 | 0 |
| 0.9222222222222222 | 0 |
| 0.9229166666666666 | 0 |
| 0.9236111111111112 | 0 |
| 0.9243055555555556 | 0 |
| 0.9249999999999999 | 0 |
| 0.9256944444444444 | 0 |
| 0.9263888888888889 | 0 |
| 0.9270833333333334 | 0 |
| 0.9277777777777777 | 0 |
| 0.9284722222222223 | 0 |
| 0.9291666666666667 | 0 |
| 0.9298611111111111 | 0 |
| 0.9305555555555555 | 0 |
| 0.93125 | 0 |
| 0.9319444444444445 | 0 |
| 0.9326388888888889 | 0 |
| 0.9333333333333332 | 0 |
| 0.9340277777777778 | 0 |
| 0.9347222222222222 | 0 |
| 0.9354166666666667 | 0 |
| 0.936111111111111 | 0 |
| 0.9368055555555556 | 0 |
| 0.9375 | 0 |
| 0.9381944444444444 | 0 |
| 0.938888888888889 | 0 |
| 0.9395833333333333 | 0 |
| 0.9402777777777778 | 0 |
| 0.9409722222222222 | 0 |
| 0.9416666666666668 | 0 |
| 0.9423611111111111 | 0 |
| 0.9430555555555555 | 0 |
| 0.94375 | 0 |
| 0.9444444444444445 | 0 |
| 0.9451388888888889 | 0 |
| 0.9458333333333333 | 0 |
| 0.9465277777777777 | 0 |
| 0.9472222222222223 | 0 |
| 0.9479166666666666 | 0 |
| 0.9486111111111111 | 0 |
| 0.9493055555555556 | 0 |
| 0.9500000000000001 | 0 |
| 0.9506944444444444 | 0 |
| 0.9513888888888888 | 0 |
| 0.9520833333333334 | 0 |
| 0.9527777777777778 | 0 |
| 0.9534722222222222 | 0 |
| 0.9541666666666666 | 0 |
| 0.9548611111111112 | 0 |
| 0.9555555555555556 | 0 |
| 0.9562499999999999 | 0 |
| 0.9569444444444444 | 0 |
| 0.9576388888888889 | 0 |
| 0.9583333333333334 | 0 |
| 0.9590277777777777 | 0 |
| 0.9597222222222223 | 0 |
| 0.9604166666666667 | 0 |
| 0.9611111111111111 | 0 |
| 0.9618055555555555 | 0 |
| 0.9625 | 0 |
| 0.9631944444444445 | 0 |
| 0.9638888888888889 | 0 |
| 0.9645833333333332 | 0 |
| 0.9652777777777778 | 0 |
| 0.9659722222222222 | 0 |
| 0.9666666666666667 | 0 |
| 0.967361111111111 | 0 |
| 0.9680555555555556 | 0 |
| 0.96875 | 0 |
| 0.9694444444444444 | 0 |
| 0.970138888888889 | 0 |
| 0.9708333333333333 | 0 |
| 0.9715277777777778 | 0 |
| 0.9722222222222222 | 0 |
| 0.9729166666666668 | 0 |
| 0.9736111111111111 | 0 |
| 0.9743055555555555 | 0 |
| 0.975 | 0 |
| 0.9756944444444445 | 0 |
| 0.9763888888888889 | 0 |
| 0.9770833333333333 | 0 |
| 0.9777777777777777 | 0 |
| 0.9784722222222223 | 0 |
| 0.9791666666666666 | 0 |
| 0.9798611111111111 | 0 |
| 0.9805555555555556 | 0 |
| 0.9812500000000001 | 0 |
| 0.9819444444444444 | 0 |
| 0.9826388888888888 | 0 |
| 0.9833333333333334 | 0 |
| 0.9840277777777778 | 0 |
| 0.9847222222222222 | 0 |
| 0.9854166666666666 | 0 |
| 0.9861111111111112 | 0 |
| 0.9868055555555556 | 0 |
| 0.9874999999999999 | 0 |
| 0.9881944444444444 | 0 |
| 0.9888888888888889 | 0 |
| 0.9895833333333334 | 0 |
| 0.9902777777777777 | 0 |
| 0.9909722222222223 | 0 |
| 0.9916666666666667 | 0 |
| 0.9923611111111111 | 0 |
| 0.9930555555555555 | 0 |
| 0.99375 | 0 |
| 0.9944444444444445 | 0 |
| 0.9951388888888889 | 0 |
| 0.9958333333333332 | 0 |
| 0.9965277777777778 | 0 |
| 0.9972222222222222 | 0 |
| 0.9979166666666667 | 0 |
| 0.998611111111111 | 0 |
| 0.9993055555555556 | 0 |